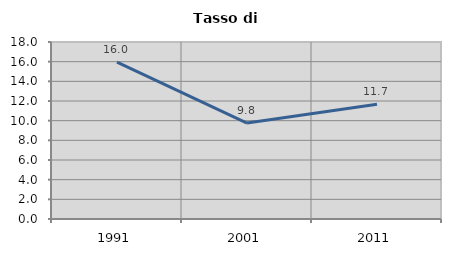
| Category | Tasso di disoccupazione   |
|---|---|
| 1991.0 | 15.96 |
| 2001.0 | 9.756 |
| 2011.0 | 11.671 |